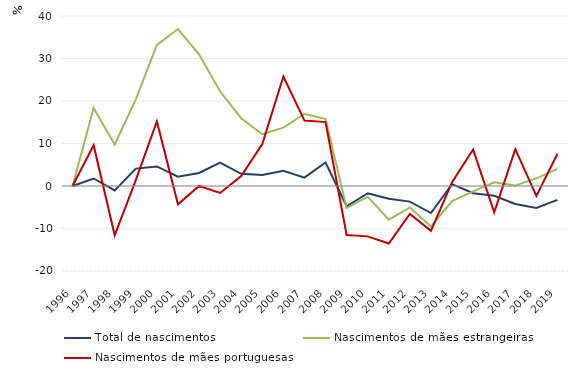
| Category | Total de nascimentos | Nascimentos de mães estrangeiras | Nascimentos de mães portuguesas |
|---|---|---|---|
| 1996.0 | 0 | 0 | 0 |
| 1997.0 | 1.767 | 18.34 | 9.601 |
| 1998.0 | -1.041 | 9.756 | -11.59 |
| 1999.0 | 4.09 | 20.4 | 1.372 |
| 2000.0 | 4.604 | 33.189 | 15.188 |
| 2001.0 | 2.2 | 36.93 | -4.308 |
| 2002.0 | 3.068 | 30.976 | 0 |
| 2003.0 | 5.5 | 22.241 | -1.637 |
| 2004.0 | 2.876 | 15.927 | 2.358 |
| 2005.0 | 2.591 | 12.176 | 9.892 |
| 2006.0 | 3.556 | 13.726 | 25.771 |
| 2007.0 | 1.982 | 16.999 | 15.392 |
| 2008.0 | 5.533 | 15.734 | 15.038 |
| 2009.0 | -4.772 | -5.184 | -11.521 |
| 2010.0 | -1.697 | -2.509 | -11.853 |
| 2011.0 | -2.996 | -7.921 | -13.542 |
| 2012.0 | -3.676 | -5.037 | -6.572 |
| 2013.0 | -6.364 | -9.531 | -10.551 |
| 2014.0 | 0.442 | -3.573 | 0.917 |
| 2015.0 | -1.708 | -1.275 | 8.571 |
| 2016.0 | -2.31 | 0.891 | -6.22 |
| 2017.0 | -4.238 | 0.096 | 8.673 |
| 2018.0 | -5.189 | 1.813 | -2.347 |
| 2019.0 | -3.262 | 4.043 | 7.572 |